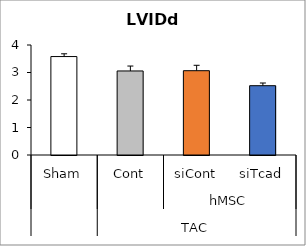
| Category | Series 0 |
|---|---|
| 0 | 3.58 |
| 1 | 3.056 |
| 2 | 3.066 |
| 3 | 2.52 |